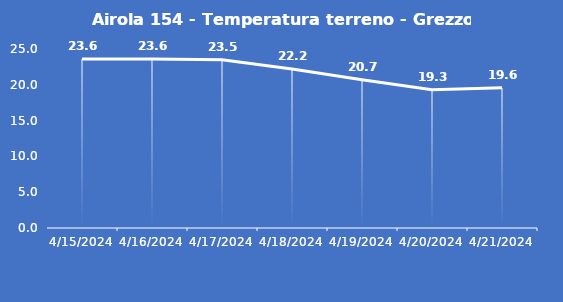
| Category | Airola 154 - Temperatura terreno - Grezzo (°C) |
|---|---|
| 4/15/24 | 23.6 |
| 4/16/24 | 23.6 |
| 4/17/24 | 23.5 |
| 4/18/24 | 22.2 |
| 4/19/24 | 20.7 |
| 4/20/24 | 19.3 |
| 4/21/24 | 19.6 |